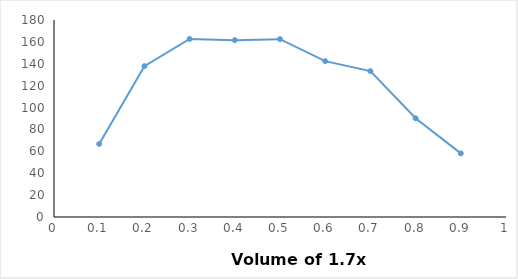
| Category | Series 0 |
|---|---|
| 0.1 | 66.78 |
| 0.2 | 137.8 |
| 0.3 | 162.7 |
| 0.4 | 161.6 |
| 0.5 | 162.5 |
| 0.6 | 142.4 |
| 0.7 | 133.3 |
| 0.8 | 90.2 |
| 0.9 | 58.1 |